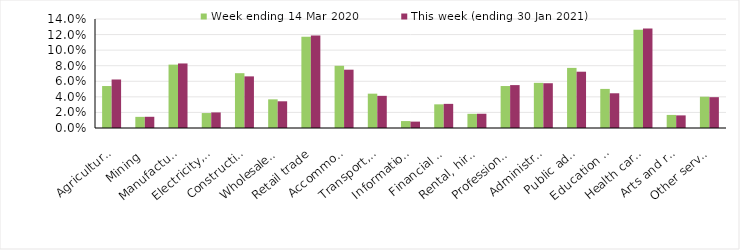
| Category | Week ending 14 Mar 2020 | This week (ending 30 Jan 2021) |
|---|---|---|
| Agriculture, forestry and fishing | 0.054 | 0.062 |
| Mining | 0.014 | 0.014 |
| Manufacturing | 0.081 | 0.083 |
| Electricity, gas, water and waste services | 0.019 | 0.02 |
| Construction | 0.07 | 0.066 |
| Wholesale trade | 0.037 | 0.034 |
| Retail trade | 0.117 | 0.119 |
| Accommodation and food services | 0.08 | 0.075 |
| Transport, postal and warehousing | 0.044 | 0.041 |
| Information media and telecommunications | 0.009 | 0.008 |
| Financial and insurance services | 0.03 | 0.031 |
| Rental, hiring and real estate services | 0.018 | 0.018 |
| Professional, scientific and technical services | 0.054 | 0.055 |
| Administrative and support services | 0.058 | 0.058 |
| Public administration and safety | 0.077 | 0.072 |
| Education and training | 0.05 | 0.045 |
| Health care and social assistance | 0.126 | 0.128 |
| Arts and recreation services | 0.017 | 0.016 |
| Other services | 0.04 | 0.04 |